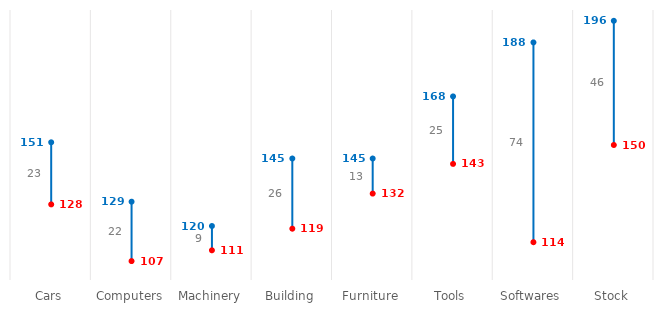
| Category | Asset Value | Series 1 | Series 2 |
|---|---|---|---|
| Cars | 128 | 151 | 139.5 |
| Computers | 107 | 129 | 118 |
| Machinery | 111 | 120 | 115.5 |
| Building | 119 | 145 | 132 |
| Furniture | 132 | 145 | 138.5 |
| Tools | 143 | 168 | 155.5 |
| Softwares | 114 | 188 | 151 |
| Stock | 150 | 196 | 173 |